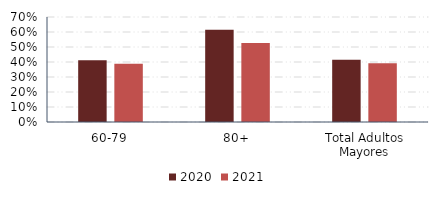
| Category | 2020 | 2021 |
|---|---|---|
| 60-79 | 0.411 | 0.389 |
| 80+ | 0.615 | 0.527 |
| Total Adultos Mayores | 0.416 | 0.391 |